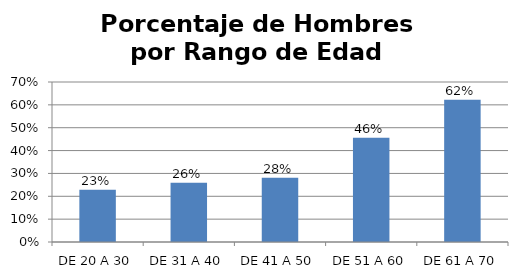
| Category | Porcentaje |
|---|---|
| DE 20 A 30 | 0.229 |
| DE 31 A 40 | 0.26 |
| DE 41 A 50 | 0.281 |
| DE 51 A 60 | 0.456 |
| DE 61 A 70 | 0.622 |